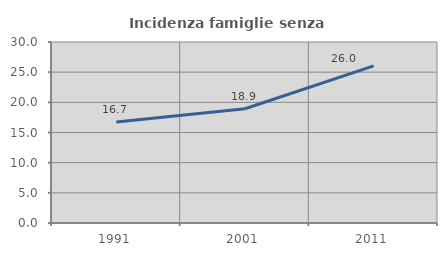
| Category | Incidenza famiglie senza nuclei |
|---|---|
| 1991.0 | 16.742 |
| 2001.0 | 18.936 |
| 2011.0 | 26.046 |